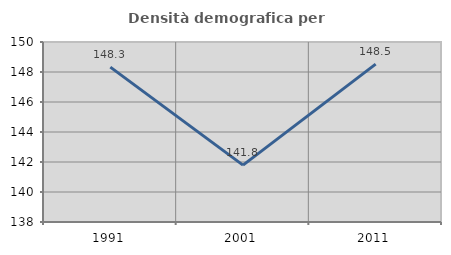
| Category | Densità demografica |
|---|---|
| 1991.0 | 148.326 |
| 2001.0 | 141.792 |
| 2011.0 | 148.528 |